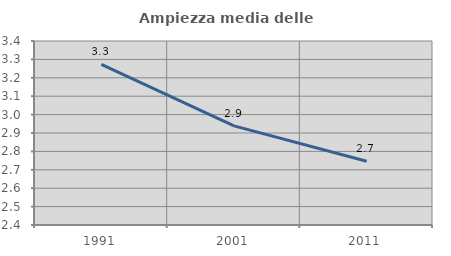
| Category | Ampiezza media delle famiglie |
|---|---|
| 1991.0 | 3.273 |
| 2001.0 | 2.939 |
| 2011.0 | 2.747 |